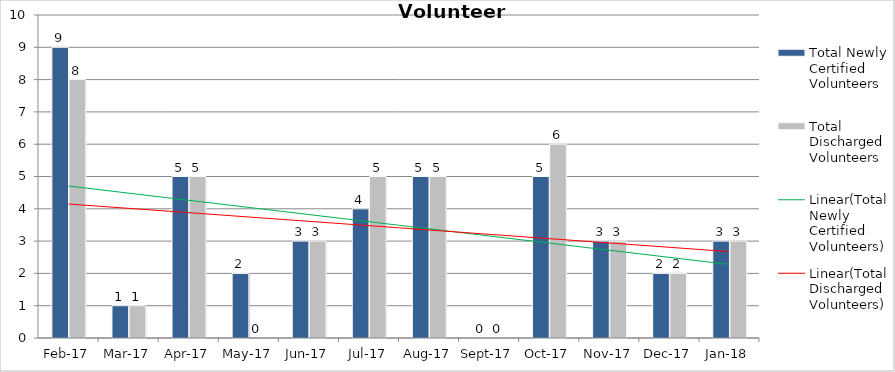
| Category | Total Newly Certified Volunteers | Total Discharged Volunteers |
|---|---|---|
| 2017-02-01 | 9 | 8 |
| 2017-03-01 | 1 | 1 |
| 2017-04-01 | 5 | 5 |
| 2017-05-01 | 2 | 0 |
| 2017-06-01 | 3 | 3 |
| 2017-07-01 | 4 | 5 |
| 2017-08-01 | 5 | 5 |
| 2017-09-01 | 0 | 0 |
| 2017-10-01 | 5 | 6 |
| 2017-11-01 | 3 | 3 |
| 2017-12-01 | 2 | 2 |
| 2018-01-01 | 3 | 3 |